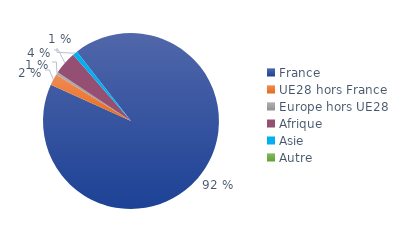
| Category | Series 0 |
|---|---|
| France | 0.92 |
| UE28 hors France | 0.021 |
| Europe hors UE28 | 0.005 |
| Afrique | 0.042 |
| Asie | 0.008 |
| Autre | 0 |